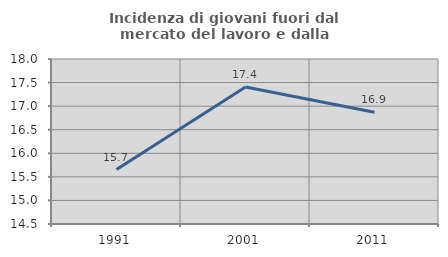
| Category | Incidenza di giovani fuori dal mercato del lavoro e dalla formazione  |
|---|---|
| 1991.0 | 15.656 |
| 2001.0 | 17.406 |
| 2011.0 | 16.869 |